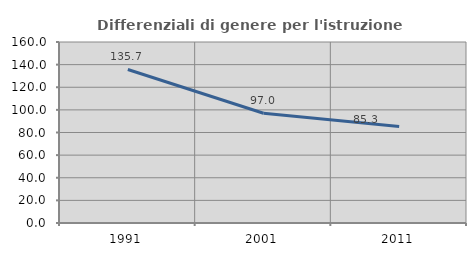
| Category | Differenziali di genere per l'istruzione superiore |
|---|---|
| 1991.0 | 135.714 |
| 2001.0 | 97.002 |
| 2011.0 | 85.336 |